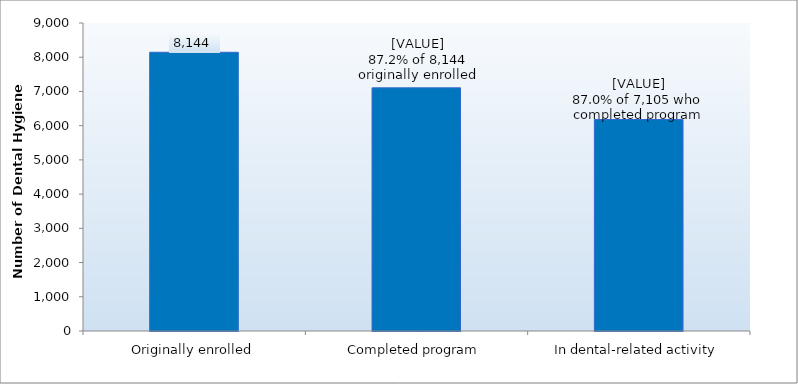
| Category | Series 0 |
|---|---|
| Originally enrolled | 8144 |
| Completed program | 7105 |
| In dental-related activity | 6179 |